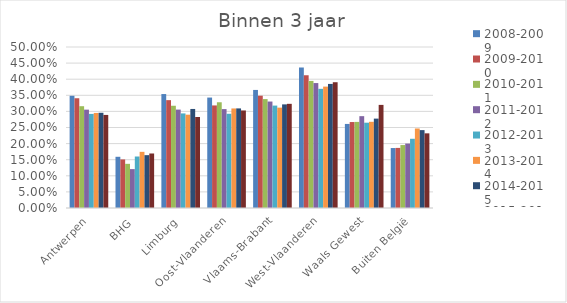
| Category | 2008-2009 | 2009-2010 | 2010-2011 | 2011-2012 | 2012-2013 | 2013-2014 | 2014-2015 | 2015-2016 |
|---|---|---|---|---|---|---|---|---|
| Antwerpen | 0.348 | 0.341 | 0.316 | 0.305 | 0.292 | 0.295 | 0.296 | 0.289 |
| BHG | 0.159 | 0.151 | 0.137 | 0.121 | 0.16 | 0.174 | 0.164 | 0.169 |
| Limburg | 0.354 | 0.335 | 0.318 | 0.306 | 0.294 | 0.29 | 0.308 | 0.283 |
| Oost-Vlaanderen | 0.343 | 0.319 | 0.328 | 0.307 | 0.293 | 0.309 | 0.309 | 0.303 |
| Vlaams-Brabant | 0.367 | 0.349 | 0.338 | 0.331 | 0.318 | 0.312 | 0.322 | 0.324 |
| West-Vlaanderen | 0.437 | 0.413 | 0.395 | 0.388 | 0.37 | 0.377 | 0.385 | 0.391 |
| Waals Gewest | 0.261 | 0.267 | 0.267 | 0.285 | 0.265 | 0.268 | 0.278 | 0.32 |
| Buiten België | 0.186 | 0.187 | 0.195 | 0.2 | 0.215 | 0.247 | 0.242 | 0.232 |